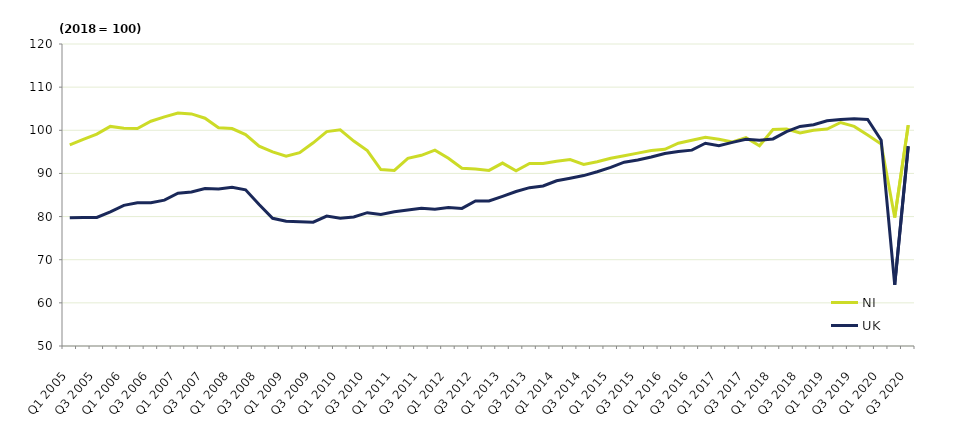
| Category | NI | UK |
|---|---|---|
| Q1 2005 | 96.6 | 79.7 |
| Q2 2005 | 97.9 | 79.8 |
| Q3 2005 | 99.1 | 79.8 |
| Q4 2005 | 100.9 | 81.1 |
| Q1 2006 | 100.5 | 82.6 |
| Q2 2006 | 100.4 | 83.2 |
| Q3 2006 | 102.1 | 83.2 |
| Q4 2006 | 103.1 | 83.8 |
| Q1 2007 | 104 | 85.4 |
| Q2 2007 | 103.8 | 85.7 |
| Q3 2007 | 102.8 | 86.5 |
| Q4 2007 | 100.6 | 86.4 |
| Q1 2008 | 100.4 | 86.8 |
| Q2 2008 | 99 | 86.2 |
| Q3 2008 | 96.3 | 82.8 |
| Q4 2008 | 95 | 79.6 |
| Q1 2009 | 94 | 78.9 |
| Q2 2009 | 94.8 | 78.8 |
| Q3 2009 | 97.1 | 78.7 |
| Q4 2009 | 99.7 | 80.1 |
| Q1 2010 | 100.1 | 79.6 |
| Q2 2010 | 97.5 | 79.9 |
| Q3 2010 | 95.3 | 80.9 |
| Q4 2010 | 90.9 | 80.5 |
| Q1 2011 | 90.7 | 81.1 |
| Q2 2011 | 93.5 | 81.5 |
| Q3 2011 | 94.2 | 81.9 |
| Q4 2011 | 95.4 | 81.7 |
| Q1 2012 | 93.5 | 82.1 |
| Q2 2012 | 91.2 | 81.9 |
| Q3 2012 | 91 | 83.6 |
| Q4 2012 | 90.7 | 83.6 |
| Q1 2013 | 92.4 | 84.7 |
| Q2 2013 | 90.6 | 85.8 |
| Q3 2013 | 92.3 | 86.7 |
| Q4 2013 | 92.3 | 87.1 |
| Q1 2014 | 92.8 | 88.3 |
| Q2 2014 | 93.2 | 88.9 |
| Q3 2014 | 92.1 | 89.5 |
| Q4 2014 | 92.7 | 90.4 |
| Q1 2015 | 93.5 | 91.4 |
| Q2 2015 | 94.1 | 92.6 |
| Q3 2015 | 94.7 | 93.1 |
| Q4 2015 | 95.3 | 93.8 |
| Q1 2016 | 95.6 | 94.6 |
| Q2 2016 | 97 | 95.1 |
| Q3 2016 | 97.7 | 95.4 |
| Q4 2016 | 98.4 | 97 |
| Q1 2017 | 97.9 | 96.4 |
| Q2 2017 | 97.3 | 97.2 |
| Q3 2017 | 98.3 | 97.9 |
| Q4 2017 | 96.4 | 97.7 |
| Q1 2018 | 100.2 | 98 |
| Q2 2018 | 100.3 | 99.7 |
| Q3 2018 | 99.4 | 100.9 |
| Q4 2018 | 100 | 101.3 |
| Q1 2019 | 100.3 | 102.2 |
| Q2 2019 | 101.8 | 102.5 |
| Q3 2019 | 100.9 | 102.7 |
| Q4 2019 | 98.9 | 102.5 |
| Q1 2020 | 96.8 | 97.7 |
| Q2 2020 | 79.8 | 64.2 |
| Q3 2020 | 101.2 | 96.3 |